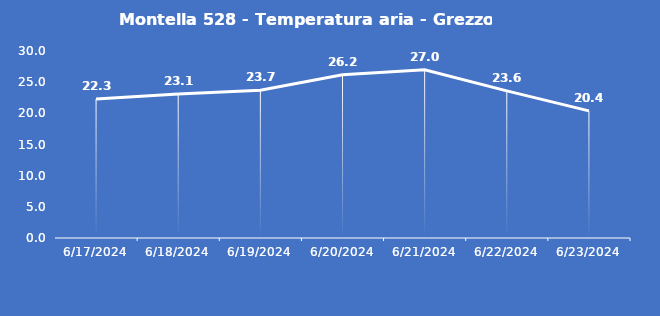
| Category | Montella 528 - Temperatura aria - Grezzo (°C) |
|---|---|
| 6/17/24 | 22.3 |
| 6/18/24 | 23.1 |
| 6/19/24 | 23.7 |
| 6/20/24 | 26.2 |
| 6/21/24 | 27 |
| 6/22/24 | 23.6 |
| 6/23/24 | 20.4 |